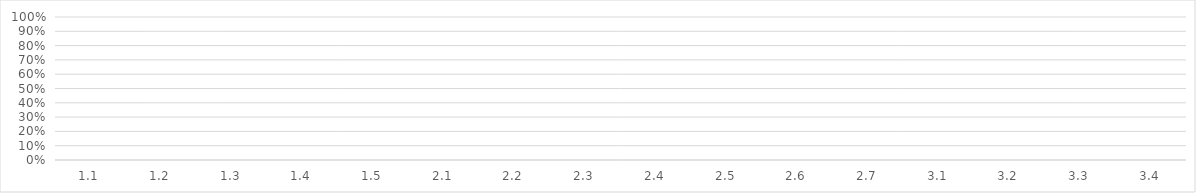
| Category | Score |
|---|---|
| 1.1 | 0 |
| 1.2 | 0 |
| 1.3 | 0 |
| 1.4 | 0 |
| 1.5 | 0 |
| 2.1 | 0 |
| 2.2 | 0 |
| 2.3 | 0 |
| 2.4 | 0 |
| 2.5 | 0 |
| 2.6 | 0 |
| 2.7 | 0 |
| 3.1 | 0 |
| 3.2 | 0 |
| 3.3 | 0 |
| 3.4 | 0 |